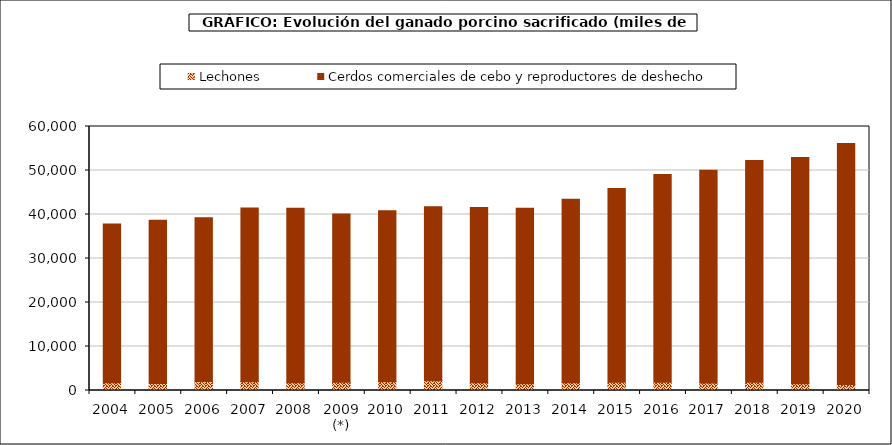
| Category | Lechones | Cerdos comerciales de cebo y reproductores de deshecho |
|---|---|---|
| 2004 | 1763.831 | 36070.811 |
| 2005 | 1577 | 37128 |
| 2006 | 2022.902 | 37254.07 |
| 2007 | 1975.516 | 39513.029 |
| 2008 | 1749.619 | 39645.973 |
| 2009 (*) | 1874.979 | 38242.923 |
| 2010 | 1998.726 | 38848.29 |
| 2011 | 2197.864 | 39545.499 |
| 2012 | 1747.365 | 39847.191 |
| 2013 | 1527.256 | 39891.21 |
| 2014 | 1743.639 | 41739.934 |
| 2015 | 1882.976 | 44007.548 |
| 2016 | 1872.511 | 47211.274 |
| 2017 | 1728.098 | 48344.657 |
| 2018 | 1849.672 | 50439.528 |
| 2019 | 1555.988 | 51426.326 |
| 2020 | 1374.901 | 54755.127 |